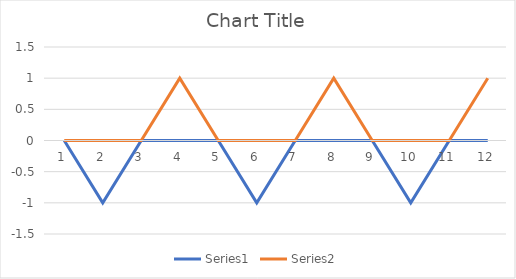
| Category | Series 0 | Series 1 |
|---|---|---|
| 0 | 0 | 0 |
| 1 | -1 | 0 |
| 2 | 0 | 0 |
| 3 | 0 | 1 |
| 4 | 0 | 0 |
| 5 | -1 | 0 |
| 6 | 0 | 0 |
| 7 | 0 | 1 |
| 8 | 0 | 0 |
| 9 | -1 | 0 |
| 10 | 0 | 0 |
| 11 | 0 | 1 |